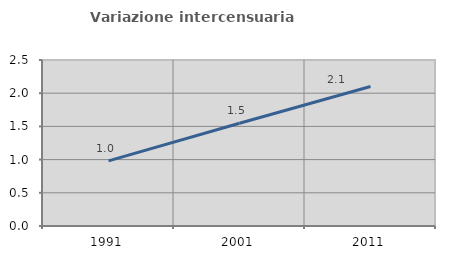
| Category | Variazione intercensuaria annua |
|---|---|
| 1991.0 | 0.98 |
| 2001.0 | 1.548 |
| 2011.0 | 2.1 |